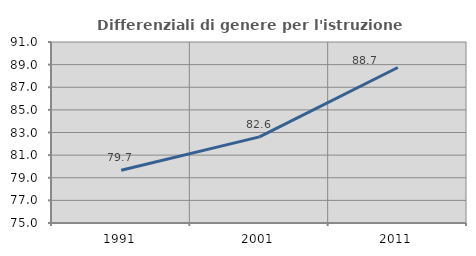
| Category | Differenziali di genere per l'istruzione superiore |
|---|---|
| 1991.0 | 79.657 |
| 2001.0 | 82.613 |
| 2011.0 | 88.747 |